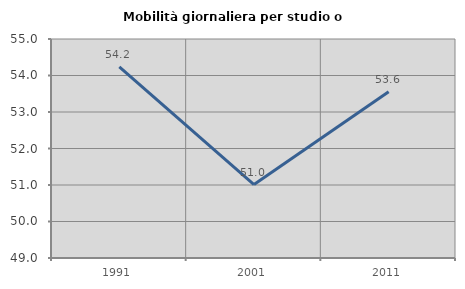
| Category | Mobilità giornaliera per studio o lavoro |
|---|---|
| 1991.0 | 54.234 |
| 2001.0 | 51.013 |
| 2011.0 | 53.553 |